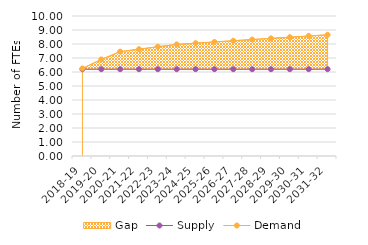
| Category | Supply | Demand |
|---|---|---|
| 2018-19 | 6.2 | 6.253 |
| 2019-20 | 6.2 | 6.897 |
| 2020-21 | 6.2 | 7.453 |
| 2021-22 | 6.2 | 7.63 |
| 2022-23 | 6.2 | 7.803 |
| 2023-24 | 6.2 | 7.969 |
| 2024-25 | 6.2 | 8.059 |
| 2025-26 | 6.2 | 8.146 |
| 2026-27 | 6.2 | 8.233 |
| 2027-28 | 6.2 | 8.318 |
| 2028-29 | 6.2 | 8.403 |
| 2029-30 | 6.2 | 8.487 |
| 2030-31 | 6.2 | 8.572 |
| 2031-32 | 6.2 | 8.657 |